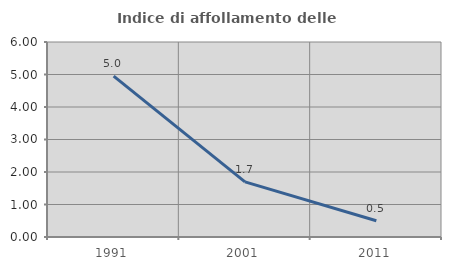
| Category | Indice di affollamento delle abitazioni  |
|---|---|
| 1991.0 | 4.952 |
| 2001.0 | 1.698 |
| 2011.0 | 0.502 |